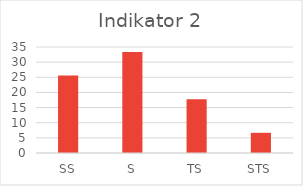
| Category | Series 0 |
|---|---|
| 0 | 25.556 |
| 1 | 33.333 |
| 2 | 17.778 |
| 3 | 6.667 |